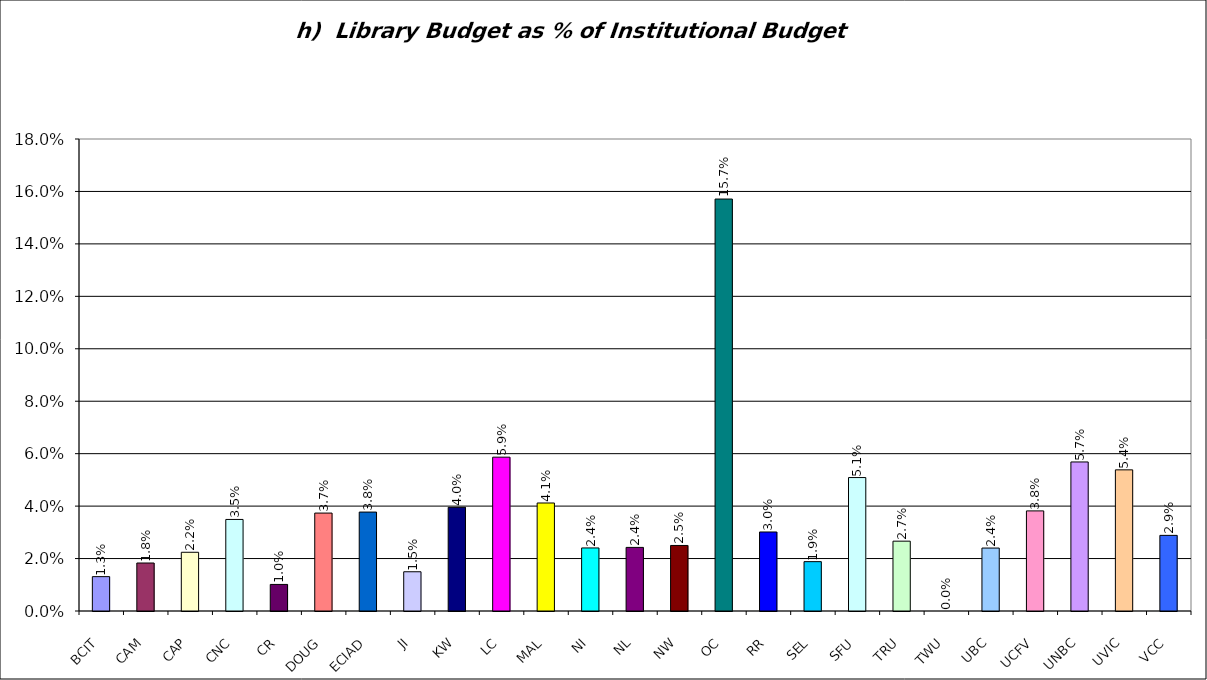
| Category | h)  Library Budget as % of Institutional Budget 7(l)/8© |
|---|---|
| BCIT | 0.013 |
| CAM | 0.018 |
| CAP | 0.022 |
| CNC | 0.035 |
| CR | 0.01 |
| DOUG | 0.037 |
| ECIAD | 0.038 |
| JI | 0.015 |
| KW | 0.04 |
| LC | 0.059 |
| MAL | 0.041 |
| NI | 0.024 |
| NL | 0.024 |
| NW | 0.025 |
| OC | 0.157 |
| RR | 0.03 |
| SEL | 0.019 |
| SFU | 0.051 |
| TRU | 0.027 |
| TWU | 0 |
| UBC | 0.024 |
| UCFV | 0.038 |
| UNBC | 0.057 |
| UVIC | 0.054 |
| VCC | 0.029 |